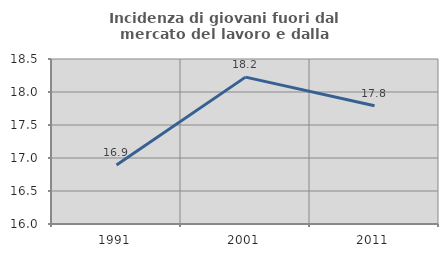
| Category | Incidenza di giovani fuori dal mercato del lavoro e dalla formazione  |
|---|---|
| 1991.0 | 16.894 |
| 2001.0 | 18.225 |
| 2011.0 | 17.791 |